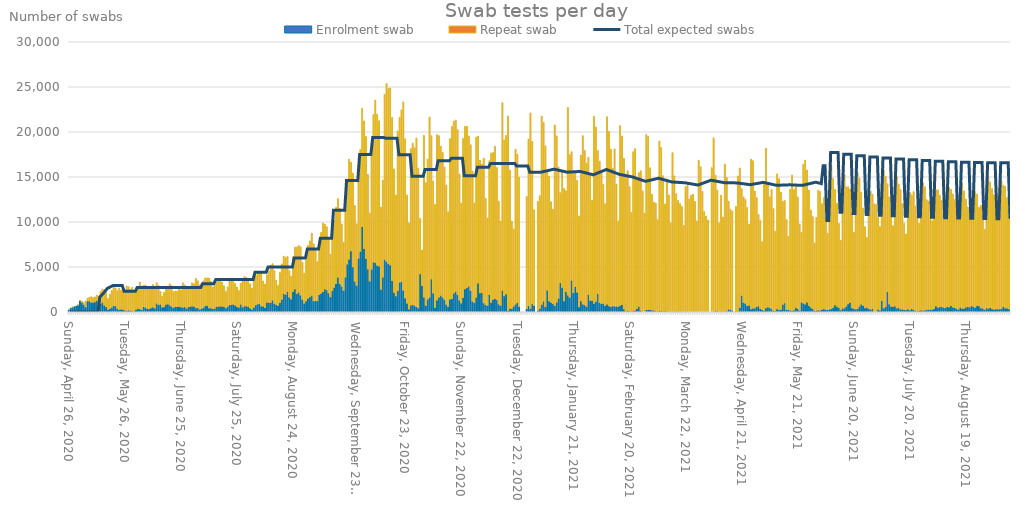
| Category | Enrolment swab | Repeat swab |
|---|---|---|
| 2020-04-26 | 223 | 0 |
| 2020-04-27 | 414 | 0 |
| 2020-04-28 | 518 | 5 |
| 2020-04-29 | 583 | 0 |
| 2020-04-30 | 655 | 0 |
| 2020-05-01 | 751 | 13 |
| 2020-05-02 | 1212 | 66 |
| 2020-05-03 | 1027 | 162 |
| 2020-05-04 | 807 | 211 |
| 2020-05-05 | 519 | 701 |
| 2020-05-06 | 1196 | 330 |
| 2020-05-07 | 1182 | 454 |
| 2020-05-08 | 1044 | 650 |
| 2020-05-09 | 1035 | 589 |
| 2020-05-10 | 1094 | 583 |
| 2020-05-11 | 1247 | 639 |
| 2020-05-12 | 615 | 1061 |
| 2020-05-13 | 921 | 1367 |
| 2020-05-14 | 1053 | 1487 |
| 2020-05-15 | 718 | 1745 |
| 2020-05-16 | 533 | 1624 |
| 2020-05-17 | 222 | 1270 |
| 2020-05-18 | 350 | 1622 |
| 2020-05-19 | 486 | 1895 |
| 2020-05-20 | 691 | 2245 |
| 2020-05-21 | 649 | 2015 |
| 2020-05-22 | 357 | 2006 |
| 2020-05-23 | 212 | 2442 |
| 2020-05-24 | 280 | 2123 |
| 2020-05-25 | 248 | 2157 |
| 2020-05-26 | 152 | 2307 |
| 2020-05-27 | 136 | 2751 |
| 2020-05-28 | 173 | 2628 |
| 2020-05-29 | 148 | 2361 |
| 2020-05-30 | 78 | 2682 |
| 2020-05-31 | 47 | 2282 |
| 2020-06-01 | 259 | 2069 |
| 2020-06-02 | 321 | 2354 |
| 2020-06-03 | 315 | 3009 |
| 2020-06-04 | 215 | 2572 |
| 2020-06-05 | 549 | 2419 |
| 2020-06-06 | 476 | 2525 |
| 2020-06-07 | 360 | 2303 |
| 2020-06-08 | 316 | 2448 |
| 2020-06-09 | 405 | 2382 |
| 2020-06-10 | 508 | 2541 |
| 2020-06-11 | 386 | 2196 |
| 2020-06-12 | 951 | 2302 |
| 2020-06-13 | 769 | 2185 |
| 2020-06-14 | 836 | 1446 |
| 2020-06-15 | 506 | 1272 |
| 2020-06-16 | 537 | 1628 |
| 2020-06-17 | 800 | 2069 |
| 2020-06-18 | 869 | 1929 |
| 2020-06-19 | 727 | 2388 |
| 2020-06-20 | 602 | 2307 |
| 2020-06-21 | 457 | 1792 |
| 2020-06-22 | 558 | 1776 |
| 2020-06-23 | 565 | 1751 |
| 2020-06-24 | 570 | 1989 |
| 2020-06-25 | 517 | 1921 |
| 2020-06-26 | 475 | 2770 |
| 2020-06-27 | 560 | 2446 |
| 2020-06-28 | 370 | 2177 |
| 2020-06-29 | 542 | 2066 |
| 2020-06-30 | 586 | 2279 |
| 2020-07-01 | 609 | 2624 |
| 2020-07-02 | 598 | 2536 |
| 2020-07-03 | 414 | 3315 |
| 2020-07-04 | 436 | 3030 |
| 2020-07-05 | 274 | 2722 |
| 2020-07-06 | 356 | 2819 |
| 2020-07-07 | 429 | 3031 |
| 2020-07-08 | 640 | 3139 |
| 2020-07-09 | 671 | 3120 |
| 2020-07-10 | 416 | 3357 |
| 2020-07-11 | 404 | 3028 |
| 2020-07-12 | 330 | 2453 |
| 2020-07-13 | 372 | 2572 |
| 2020-07-14 | 587 | 2727 |
| 2020-07-15 | 580 | 3041 |
| 2020-07-16 | 625 | 2999 |
| 2020-07-17 | 592 | 2740 |
| 2020-07-18 | 573 | 2330 |
| 2020-07-19 | 419 | 1865 |
| 2020-07-20 | 592 | 2194 |
| 2020-07-21 | 766 | 2753 |
| 2020-07-22 | 793 | 2769 |
| 2020-07-23 | 827 | 2764 |
| 2020-07-24 | 717 | 2464 |
| 2020-07-25 | 543 | 2241 |
| 2020-07-26 | 483 | 1896 |
| 2020-07-27 | 823 | 2385 |
| 2020-07-28 | 512 | 2936 |
| 2020-07-29 | 642 | 3288 |
| 2020-07-30 | 630 | 3205 |
| 2020-07-31 | 578 | 3121 |
| 2020-08-01 | 381 | 2746 |
| 2020-08-02 | 253 | 2392 |
| 2020-08-03 | 477 | 3153 |
| 2020-08-04 | 754 | 3276 |
| 2020-08-05 | 852 | 3606 |
| 2020-08-06 | 885 | 3535 |
| 2020-08-07 | 621 | 3759 |
| 2020-08-08 | 615 | 2837 |
| 2020-08-09 | 445 | 2671 |
| 2020-08-10 | 1043 | 3107 |
| 2020-08-11 | 1032 | 3526 |
| 2020-08-12 | 1030 | 4162 |
| 2020-08-13 | 1299 | 4071 |
| 2020-08-14 | 919 | 3668 |
| 2020-08-15 | 801 | 2732 |
| 2020-08-16 | 666 | 2295 |
| 2020-08-17 | 996 | 3404 |
| 2020-08-18 | 1360 | 3987 |
| 2020-08-19 | 2020 | 4162 |
| 2020-08-20 | 1895 | 4144 |
| 2020-08-21 | 2250 | 3933 |
| 2020-08-22 | 1617 | 2982 |
| 2020-08-23 | 1400 | 2584 |
| 2020-08-24 | 2222 | 3917 |
| 2020-08-25 | 2517 | 4675 |
| 2020-08-26 | 1990 | 5230 |
| 2020-08-27 | 2164 | 5213 |
| 2020-08-28 | 1836 | 5407 |
| 2020-08-29 | 1374 | 4142 |
| 2020-08-30 | 938 | 3372 |
| 2020-08-31 | 1183 | 4604 |
| 2020-09-01 | 1480 | 5920 |
| 2020-09-02 | 1643 | 6257 |
| 2020-09-03 | 1809 | 6929 |
| 2020-09-04 | 1188 | 6375 |
| 2020-09-05 | 1240 | 5806 |
| 2020-09-06 | 1201 | 4416 |
| 2020-09-07 | 1892 | 5985 |
| 2020-09-08 | 2034 | 6808 |
| 2020-09-09 | 2211 | 7664 |
| 2020-09-10 | 2524 | 7239 |
| 2020-09-11 | 2421 | 7048 |
| 2020-09-12 | 2078 | 6179 |
| 2020-09-13 | 1649 | 4781 |
| 2020-09-14 | 2318 | 6131 |
| 2020-09-15 | 2700 | 7495 |
| 2020-09-16 | 3119 | 8488 |
| 2020-09-17 | 3821 | 8760 |
| 2020-09-18 | 3114 | 8398 |
| 2020-09-19 | 2826 | 6963 |
| 2020-09-20 | 2370 | 5353 |
| 2020-09-21 | 3843 | 7627 |
| 2020-09-22 | 5276 | 8977 |
| 2020-09-23 | 5833 | 11151 |
| 2020-09-24 | 6740 | 9910 |
| 2020-09-25 | 4971 | 10465 |
| 2020-09-26 | 3382 | 8451 |
| 2020-09-27 | 2929 | 6869 |
| 2020-09-28 | 5946 | 9626 |
| 2020-09-29 | 6695 | 11352 |
| 2020-09-30 | 9452 | 13202 |
| 2020-10-01 | 7007 | 14229 |
| 2020-10-02 | 5901 | 13587 |
| 2020-10-03 | 4741 | 10533 |
| 2020-10-04 | 3401 | 7608 |
| 2020-10-05 | 4725 | 13208 |
| 2020-10-06 | 5523 | 16406 |
| 2020-10-07 | 5465 | 18084 |
| 2020-10-08 | 5149 | 16836 |
| 2020-10-09 | 5059 | 16189 |
| 2020-10-10 | 2477 | 9172 |
| 2020-10-11 | 3840 | 10826 |
| 2020-10-12 | 5804 | 18379 |
| 2020-10-13 | 5581 | 19806 |
| 2020-10-14 | 5324 | 19508 |
| 2020-10-15 | 5186 | 19709 |
| 2020-10-16 | 3442 | 18170 |
| 2020-10-17 | 2149 | 13749 |
| 2020-10-18 | 1745 | 11259 |
| 2020-10-19 | 2341 | 17781 |
| 2020-10-20 | 3270 | 18365 |
| 2020-10-21 | 3342 | 19109 |
| 2020-10-22 | 2380 | 20964 |
| 2020-10-23 | 1515 | 17732 |
| 2020-10-24 | 931 | 12077 |
| 2020-10-25 | 282 | 9612 |
| 2020-10-26 | 716 | 17435 |
| 2020-10-27 | 782 | 17976 |
| 2020-10-28 | 703 | 17538 |
| 2020-10-29 | 554 | 18782 |
| 2020-10-30 | 411 | 15588 |
| 2020-10-31 | 4200 | 6194 |
| 2020-11-01 | 2905 | 3972 |
| 2020-11-02 | 1614 | 18004 |
| 2020-11-03 | 700 | 13686 |
| 2020-11-04 | 1392 | 15593 |
| 2020-11-05 | 1611 | 20053 |
| 2020-11-06 | 3635 | 15950 |
| 2020-11-07 | 2062 | 12497 |
| 2020-11-08 | 472 | 11468 |
| 2020-11-09 | 1278 | 18413 |
| 2020-11-10 | 1603 | 17993 |
| 2020-11-11 | 1810 | 16617 |
| 2020-11-12 | 1621 | 16101 |
| 2020-11-13 | 1362 | 14745 |
| 2020-11-14 | 809 | 13291 |
| 2020-11-15 | 560 | 10573 |
| 2020-11-16 | 1390 | 17868 |
| 2020-11-17 | 1444 | 19174 |
| 2020-11-18 | 2062 | 19123 |
| 2020-11-19 | 2244 | 19077 |
| 2020-11-20 | 1882 | 18376 |
| 2020-11-21 | 1280 | 14045 |
| 2020-11-22 | 955 | 11138 |
| 2020-11-23 | 1572 | 17710 |
| 2020-11-24 | 2535 | 18077 |
| 2020-11-25 | 2653 | 17985 |
| 2020-11-26 | 2831 | 16725 |
| 2020-11-27 | 2353 | 16233 |
| 2020-11-28 | 1166 | 14494 |
| 2020-11-29 | 1002 | 11100 |
| 2020-11-30 | 1597 | 17808 |
| 2020-12-01 | 3176 | 16375 |
| 2020-12-02 | 2081 | 14772 |
| 2020-12-03 | 2120 | 14289 |
| 2020-12-04 | 971 | 16106 |
| 2020-12-05 | 782 | 11820 |
| 2020-12-06 | 675 | 9762 |
| 2020-12-07 | 1910 | 14896 |
| 2020-12-08 | 1030 | 16621 |
| 2020-12-09 | 1344 | 16385 |
| 2020-12-10 | 1462 | 16965 |
| 2020-12-11 | 1321 | 14729 |
| 2020-12-12 | 843 | 11472 |
| 2020-12-13 | 703 | 9405 |
| 2020-12-14 | 2378 | 20880 |
| 2020-12-15 | 1754 | 17363 |
| 2020-12-16 | 1967 | 17639 |
| 2020-12-17 | 117 | 21669 |
| 2020-12-18 | 363 | 15395 |
| 2020-12-19 | 361 | 9718 |
| 2020-12-20 | 611 | 8607 |
| 2020-12-21 | 836 | 17246 |
| 2020-12-22 | 1015 | 16508 |
| 2020-12-23 | 579 | 14387 |
| 2020-12-24 | 0 | 0 |
| 2020-12-25 | 0 | 0 |
| 2020-12-26 | 0 | 0 |
| 2020-12-27 | 356 | 12472 |
| 2020-12-28 | 670 | 18542 |
| 2020-12-29 | 355 | 21762 |
| 2020-12-30 | 872 | 18067 |
| 2020-12-31 | 675 | 10681 |
| 2021-01-01 | 0 | 0 |
| 2021-01-02 | 124 | 12150 |
| 2021-01-03 | 353 | 12553 |
| 2021-01-04 | 815 | 20950 |
| 2021-01-05 | 1167 | 19903 |
| 2021-01-06 | 550 | 17916 |
| 2021-01-07 | 2381 | 13217 |
| 2021-01-08 | 1183 | 13919 |
| 2021-01-09 | 1036 | 11222 |
| 2021-01-10 | 903 | 10508 |
| 2021-01-11 | 658 | 20122 |
| 2021-01-12 | 1059 | 18509 |
| 2021-01-13 | 1492 | 14624 |
| 2021-01-14 | 3214 | 10039 |
| 2021-01-15 | 2690 | 13038 |
| 2021-01-16 | 1203 | 12525 |
| 2021-01-17 | 2235 | 11241 |
| 2021-01-18 | 1843 | 20878 |
| 2021-01-19 | 1582 | 15889 |
| 2021-01-20 | 3511 | 14298 |
| 2021-01-21 | 2124 | 13435 |
| 2021-01-22 | 2777 | 12760 |
| 2021-01-23 | 2161 | 12488 |
| 2021-01-24 | 533 | 10138 |
| 2021-01-25 | 1197 | 16237 |
| 2021-01-26 | 844 | 18748 |
| 2021-01-27 | 768 | 17183 |
| 2021-01-28 | 588 | 15944 |
| 2021-01-29 | 1904 | 15296 |
| 2021-01-30 | 1253 | 14008 |
| 2021-01-31 | 1246 | 11161 |
| 2021-02-01 | 922 | 20797 |
| 2021-02-02 | 1125 | 19437 |
| 2021-02-03 | 2013 | 15929 |
| 2021-02-04 | 999 | 15744 |
| 2021-02-05 | 891 | 14504 |
| 2021-02-06 | 929 | 13263 |
| 2021-02-07 | 659 | 11370 |
| 2021-02-08 | 828 | 20860 |
| 2021-02-09 | 641 | 19428 |
| 2021-02-10 | 545 | 17537 |
| 2021-02-11 | 647 | 15316 |
| 2021-02-12 | 618 | 17506 |
| 2021-02-13 | 602 | 13617 |
| 2021-02-14 | 581 | 9527 |
| 2021-02-15 | 682 | 20011 |
| 2021-02-16 | 795 | 18764 |
| 2021-02-17 | 298 | 16774 |
| 2021-02-18 | 47 | 14977 |
| 2021-02-19 | 152 | 15548 |
| 2021-02-20 | 78 | 13849 |
| 2021-02-21 | 48 | 11019 |
| 2021-02-22 | 93 | 17712 |
| 2021-02-23 | 148 | 17997 |
| 2021-02-24 | 331 | 14340 |
| 2021-02-25 | 591 | 14891 |
| 2021-02-26 | 146 | 15541 |
| 2021-02-27 | 0 | 13456 |
| 2021-02-28 | 0 | 10975 |
| 2021-03-01 | 233 | 19487 |
| 2021-03-02 | 215 | 19313 |
| 2021-03-03 | 219 | 15812 |
| 2021-03-04 | 155 | 12931 |
| 2021-03-05 | 168 | 12043 |
| 2021-03-06 | 91 | 11998 |
| 2021-03-07 | 49 | 10194 |
| 2021-03-08 | 106 | 18894 |
| 2021-03-09 | 102 | 18171 |
| 2021-03-10 | 45 | 15082 |
| 2021-03-11 | 84 | 11922 |
| 2021-03-12 | 30 | 14753 |
| 2021-03-13 | 17 | 12989 |
| 2021-03-14 | 24 | 9876 |
| 2021-03-15 | 21 | 17675 |
| 2021-03-16 | 12 | 15113 |
| 2021-03-17 | 14 | 13123 |
| 2021-03-18 | 29 | 12359 |
| 2021-03-19 | 8 | 12038 |
| 2021-03-20 | 1 | 11708 |
| 2021-03-21 | 0 | 9616 |
| 2021-03-22 | 26 | 13897 |
| 2021-03-23 | 0 | 14095 |
| 2021-03-24 | 0 | 12558 |
| 2021-03-25 | 0 | 12972 |
| 2021-03-26 | 0 | 13080 |
| 2021-03-27 | 0 | 12274 |
| 2021-03-28 | 0 | 10112 |
| 2021-03-29 | 0 | 16864 |
| 2021-03-30 | 0 | 16131 |
| 2021-03-31 | 0 | 13406 |
| 2021-04-01 | 0 | 11143 |
| 2021-04-02 | 0 | 10653 |
| 2021-04-03 | 0 | 10225 |
| 2021-04-04 | 0 | 0 |
| 2021-04-05 | 0 | 16029 |
| 2021-04-06 | 0 | 19343 |
| 2021-04-07 | 128 | 15074 |
| 2021-04-08 | 55 | 13501 |
| 2021-04-09 | 6 | 9893 |
| 2021-04-10 | 20 | 12961 |
| 2021-04-11 | 2 | 10548 |
| 2021-04-12 | 38 | 16396 |
| 2021-04-13 | 73 | 14872 |
| 2021-04-14 | 280 | 12017 |
| 2021-04-15 | 245 | 11152 |
| 2021-04-16 | 132 | 11097 |
| 2021-04-17 | 0 | 0 |
| 2021-04-18 | 26 | 11698 |
| 2021-04-19 | 61 | 15058 |
| 2021-04-20 | 464 | 15538 |
| 2021-04-21 | 1813 | 11885 |
| 2021-04-22 | 1025 | 11765 |
| 2021-04-23 | 930 | 11564 |
| 2021-04-24 | 655 | 10966 |
| 2021-04-25 | 711 | 9066 |
| 2021-04-26 | 296 | 16675 |
| 2021-04-27 | 377 | 16433 |
| 2021-04-28 | 403 | 13039 |
| 2021-04-29 | 562 | 12163 |
| 2021-04-30 | 639 | 10181 |
| 2021-05-01 | 357 | 9812 |
| 2021-05-02 | 210 | 7606 |
| 2021-05-03 | 134 | 14098 |
| 2021-05-04 | 405 | 17802 |
| 2021-05-05 | 521 | 13745 |
| 2021-05-06 | 457 | 12344 |
| 2021-05-07 | 311 | 13310 |
| 2021-05-08 | 126 | 11356 |
| 2021-05-09 | 94 | 8872 |
| 2021-05-10 | 318 | 15027 |
| 2021-05-11 | 204 | 14603 |
| 2021-05-12 | 243 | 13058 |
| 2021-05-13 | 802 | 11488 |
| 2021-05-14 | 983 | 11404 |
| 2021-05-15 | 217 | 10047 |
| 2021-05-16 | 245 | 8153 |
| 2021-05-17 | 156 | 13461 |
| 2021-05-18 | 129 | 15071 |
| 2021-05-19 | 169 | 13430 |
| 2021-05-20 | 462 | 13634 |
| 2021-05-21 | 354 | 12435 |
| 2021-05-22 | 147 | 9625 |
| 2021-05-23 | 1058 | 7797 |
| 2021-05-24 | 940 | 15442 |
| 2021-05-25 | 830 | 16044 |
| 2021-05-26 | 1049 | 14731 |
| 2021-05-27 | 678 | 12868 |
| 2021-05-28 | 502 | 10832 |
| 2021-05-29 | 322 | 10271 |
| 2021-05-30 | 132 | 7538 |
| 2021-05-31 | 145 | 10358 |
| 2021-06-01 | 181 | 13357 |
| 2021-06-02 | 147 | 13248 |
| 2021-06-03 | 237 | 11801 |
| 2021-06-04 | 324 | 12383 |
| 2021-06-05 | 221 | 9983 |
| 2021-06-06 | 216 | 8537 |
| 2021-06-07 | 288 | 14151 |
| 2021-06-08 | 323 | 16000 |
| 2021-06-09 | 459 | 14367 |
| 2021-06-10 | 747 | 12880 |
| 2021-06-11 | 566 | 11526 |
| 2021-06-12 | 458 | 9367 |
| 2021-06-13 | 194 | 7784 |
| 2021-06-14 | 385 | 13316 |
| 2021-06-15 | 405 | 14898 |
| 2021-06-16 | 603 | 13302 |
| 2021-06-17 | 870 | 13035 |
| 2021-06-18 | 1018 | 12648 |
| 2021-06-19 | 427 | 10557 |
| 2021-06-20 | 339 | 8509 |
| 2021-06-21 | 284 | 14193 |
| 2021-06-22 | 325 | 15171 |
| 2021-06-23 | 599 | 14256 |
| 2021-06-24 | 839 | 12482 |
| 2021-06-25 | 684 | 10877 |
| 2021-06-26 | 422 | 9055 |
| 2021-06-27 | 450 | 7830 |
| 2021-06-28 | 348 | 12270 |
| 2021-06-29 | 259 | 13147 |
| 2021-06-30 | 331 | 12749 |
| 2021-07-01 | 0 | 12016 |
| 2021-07-02 | 0 | 11947 |
| 2021-07-03 | 236 | 10282 |
| 2021-07-04 | 153 | 9338 |
| 2021-07-05 | 1229 | 13142 |
| 2021-07-06 | 398 | 15389 |
| 2021-07-07 | 569 | 14512 |
| 2021-07-08 | 2215 | 12032 |
| 2021-07-09 | 843 | 11945 |
| 2021-07-10 | 594 | 10821 |
| 2021-07-11 | 562 | 9031 |
| 2021-07-12 | 627 | 13104 |
| 2021-07-13 | 395 | 14652 |
| 2021-07-14 | 475 | 13750 |
| 2021-07-15 | 271 | 13325 |
| 2021-07-16 | 292 | 11745 |
| 2021-07-17 | 233 | 9625 |
| 2021-07-18 | 185 | 8489 |
| 2021-07-19 | 281 | 11749 |
| 2021-07-20 | 180 | 13086 |
| 2021-07-21 | 336 | 12677 |
| 2021-07-22 | 217 | 13144 |
| 2021-07-23 | 112 | 11657 |
| 2021-07-24 | 60 | 10701 |
| 2021-07-25 | 99 | 9757 |
| 2021-07-26 | 168 | 13195 |
| 2021-07-27 | 129 | 14245 |
| 2021-07-28 | 159 | 13747 |
| 2021-07-29 | 254 | 12216 |
| 2021-07-30 | 263 | 12054 |
| 2021-07-31 | 258 | 10625 |
| 2021-08-01 | 233 | 9902 |
| 2021-08-02 | 325 | 12727 |
| 2021-08-03 | 630 | 12943 |
| 2021-08-04 | 464 | 13107 |
| 2021-08-05 | 542 | 12444 |
| 2021-08-06 | 542 | 11807 |
| 2021-08-07 | 486 | 10378 |
| 2021-08-08 | 438 | 10092 |
| 2021-08-09 | 566 | 12666 |
| 2021-08-10 | 504 | 13355 |
| 2021-08-11 | 680 | 12946 |
| 2021-08-12 | 490 | 12624 |
| 2021-08-13 | 451 | 12013 |
| 2021-08-14 | 348 | 10883 |
| 2021-08-15 | 261 | 10279 |
| 2021-08-16 | 492 | 13126 |
| 2021-08-17 | 362 | 14007 |
| 2021-08-18 | 368 | 13087 |
| 2021-08-19 | 490 | 12037 |
| 2021-08-20 | 566 | 11104 |
| 2021-08-21 | 511 | 10594 |
| 2021-08-22 | 661 | 9822 |
| 2021-08-23 | 586 | 12641 |
| 2021-08-24 | 471 | 12973 |
| 2021-08-25 | 667 | 12431 |
| 2021-08-26 | 631 | 10974 |
| 2021-08-27 | 403 | 11460 |
| 2021-08-28 | 397 | 10124 |
| 2021-08-29 | 220 | 8968 |
| 2021-08-30 | 418 | 11374 |
| 2021-08-31 | 373 | 14539 |
| 2021-09-01 | 467 | 13970 |
| 2021-09-02 | 318 | 13384 |
| 2021-09-03 | 254 | 12784 |
| 2021-09-04 | 302 | 12124 |
| 2021-09-05 | 307 | 11116 |
| 2021-09-06 | 316 | 13480 |
| 2021-09-07 | 339 | 14225 |
| 2021-09-08 | 563 | 13497 |
| 2021-09-09 | 403 | 13571 |
| 2021-09-10 | 396 | 12301 |
| 2021-09-11 | 297 | 11345 |